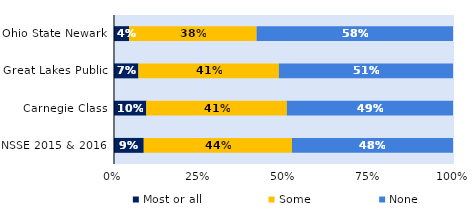
| Category | Most or all | Some | None |
|---|---|---|---|
| Ohio State Newark | 0.045 | 0.376 | 0.579 |
| Great Lakes Public | 0.072 | 0.414 | 0.514 |
| Carnegie Class | 0.095 | 0.415 | 0.49 |
| NSSE 2015 & 2016 | 0.088 | 0.437 | 0.475 |